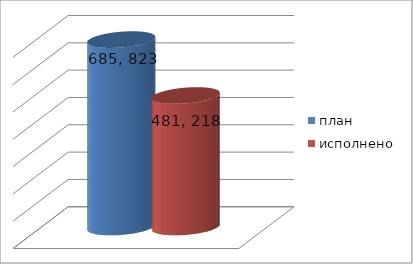
| Category | план | исполнено |
|---|---|---|
| 0 | 685823837 | 481218694.12 |